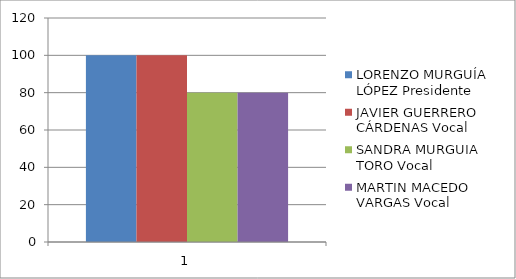
| Category | LORENZO MURGUÍA LÓPEZ Presidente | JAVIER GUERRERO CÁRDENAS Vocal | SANDRA MURGUIA TORO Vocal | MARTIN MACEDO VARGAS Vocal |
|---|---|---|---|---|
| 0 | 100 | 100 | 80 | 80 |